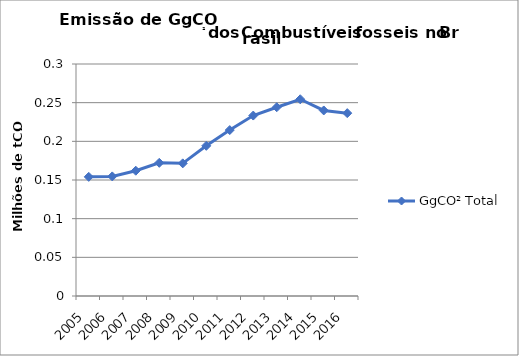
| Category | GgCO² Total |
|---|---|
| 2005.0 | 154061.706 |
| 2006.0 | 154652.866 |
| 2007.0 | 161993.831 |
| 2008.0 | 172218.184 |
| 2009.0 | 171524.578 |
| 2010.0 | 194195.023 |
| 2011.0 | 214561.1 |
| 2012.0 | 233331.884 |
| 2013.0 | 244111.539 |
| 2014.0 | 254408.4 |
| 2015.0 | 239927.886 |
| 2016.0 | 236455.878 |